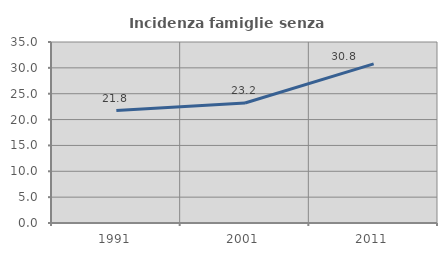
| Category | Incidenza famiglie senza nuclei |
|---|---|
| 1991.0 | 21.751 |
| 2001.0 | 23.194 |
| 2011.0 | 30.76 |